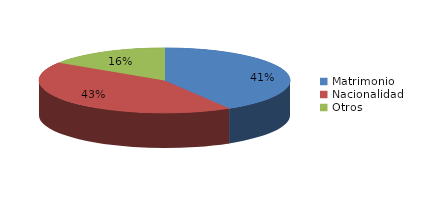
| Category | Series 0 |
|---|---|
| Matrimonio | 219 |
| Nacionalidad | 226 |
| Otros | 84 |